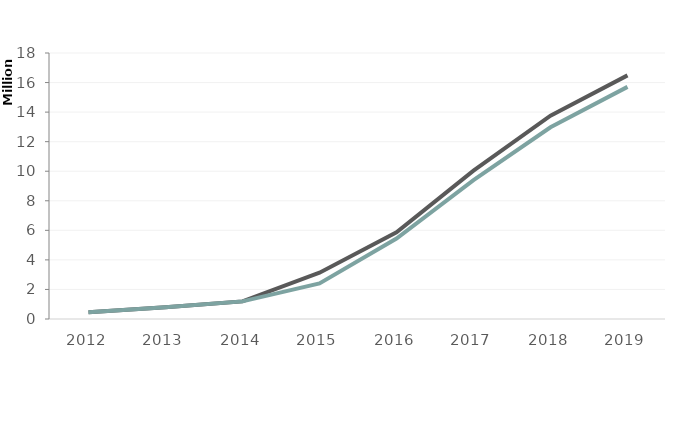
| Category | All | Large |
|---|---|---|
| 2012.0 | 457433 | 457433 |
| 2013.0 | 794333 | 794333 |
| 2014.0 | 1192812 | 1192812 |
| 2015.0 | 3131380 | 2407850 |
| 2016.0 | 5870537 | 5446157 |
| 2017.0 | 10036274 | 9399479 |
| 2018.0 | 13763548 | 12971863 |
| 2019.0 | 16485968 | 15706298 |